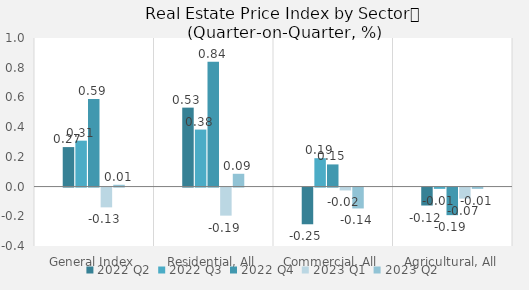
| Category | 2022 | 2023 |
|---|---|---|
| General Index | 0.589 | 0.012 |
| Residential, All | 0.839 | 0.086 |
| Commercial, All | 0.149 | -0.141 |
| Agricultural, All | -0.186 | -0.009 |